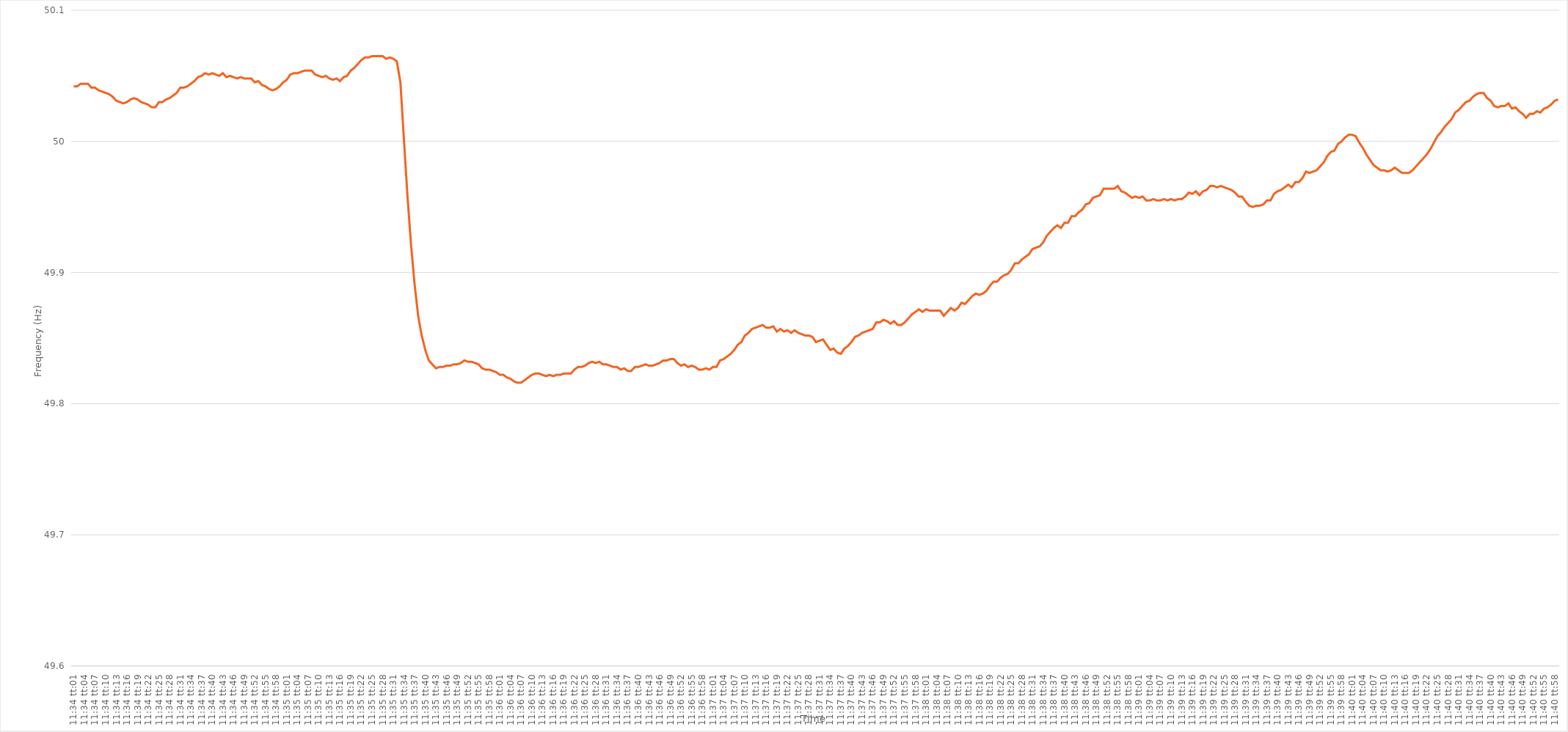
| Category | Series 0 |
|---|---|
| 0.48195601851851855 | 50.042 |
| 0.4819675925925926 | 50.042 |
| 0.4819791666666667 | 50.044 |
| 0.4819907407407407 | 50.044 |
| 0.48200231481481487 | 50.044 |
| 0.4820138888888889 | 50.041 |
| 0.48202546296296295 | 50.041 |
| 0.48203703703703704 | 50.039 |
| 0.4820486111111111 | 50.038 |
| 0.4820601851851852 | 50.037 |
| 0.4820717592592592 | 50.036 |
| 0.48208333333333336 | 50.034 |
| 0.4820949074074074 | 50.031 |
| 0.4821064814814815 | 50.03 |
| 0.48211805555555554 | 50.029 |
| 0.48212962962962963 | 50.03 |
| 0.48214120370370367 | 50.032 |
| 0.4821527777777778 | 50.033 |
| 0.48216435185185186 | 50.032 |
| 0.48217592592592595 | 50.03 |
| 0.4821875 | 50.029 |
| 0.4821990740740741 | 50.028 |
| 0.4822106481481481 | 50.026 |
| 0.4822222222222223 | 50.026 |
| 0.4822337962962963 | 50.03 |
| 0.48224537037037035 | 50.03 |
| 0.48225694444444445 | 50.032 |
| 0.4822685185185185 | 50.033 |
| 0.4822800925925926 | 50.035 |
| 0.4822916666666666 | 50.037 |
| 0.48230324074074077 | 50.041 |
| 0.4823148148148148 | 50.041 |
| 0.4823263888888889 | 50.042 |
| 0.48233796296296294 | 50.044 |
| 0.48234953703703703 | 50.046 |
| 0.4823611111111111 | 50.049 |
| 0.4823726851851852 | 50.05 |
| 0.48238425925925926 | 50.052 |
| 0.48239583333333336 | 50.051 |
| 0.4824074074074074 | 50.052 |
| 0.4824189814814815 | 50.051 |
| 0.48243055555555553 | 50.05 |
| 0.4824421296296297 | 50.052 |
| 0.4824537037037037 | 50.049 |
| 0.4824652777777778 | 50.05 |
| 0.48247685185185185 | 50.049 |
| 0.4824884259259259 | 50.048 |
| 0.4825 | 50.049 |
| 0.482511574074074 | 50.048 |
| 0.4825231481481482 | 50.048 |
| 0.4825347222222222 | 50.048 |
| 0.4825462962962963 | 50.045 |
| 0.48255787037037035 | 50.046 |
| 0.48256944444444444 | 50.043 |
| 0.4825810185185185 | 50.042 |
| 0.48259259259259263 | 50.04 |
| 0.48260416666666667 | 50.039 |
| 0.48261574074074076 | 50.04 |
| 0.4826273148148148 | 50.042 |
| 0.4826388888888889 | 50.045 |
| 0.48265046296296293 | 50.047 |
| 0.4826620370370371 | 50.051 |
| 0.4826736111111111 | 50.052 |
| 0.4826851851851852 | 50.052 |
| 0.48269675925925926 | 50.053 |
| 0.48270833333333335 | 50.054 |
| 0.4827199074074074 | 50.054 |
| 0.48273148148148143 | 50.054 |
| 0.4827430555555556 | 50.051 |
| 0.4827546296296296 | 50.05 |
| 0.4827662037037037 | 50.049 |
| 0.48277777777777775 | 50.05 |
| 0.48278935185185184 | 50.048 |
| 0.4828009259259259 | 50.047 |
| 0.48281250000000003 | 50.048 |
| 0.48282407407407407 | 50.046 |
| 0.48283564814814817 | 50.049 |
| 0.4828472222222222 | 50.05 |
| 0.4828587962962963 | 50.054 |
| 0.48287037037037034 | 50.056 |
| 0.4828819444444445 | 50.059 |
| 0.4828935185185185 | 50.062 |
| 0.4829050925925926 | 50.064 |
| 0.48291666666666666 | 50.064 |
| 0.48292824074074076 | 50.065 |
| 0.4829398148148148 | 50.065 |
| 0.48295138888888894 | 50.065 |
| 0.482962962962963 | 50.065 |
| 0.482974537037037 | 50.063 |
| 0.4829861111111111 | 50.064 |
| 0.48299768518518515 | 50.063 |
| 0.48300925925925925 | 50.061 |
| 0.4830208333333333 | 50.045 |
| 0.48303240740740744 | 50.001 |
| 0.4830439814814815 | 49.958 |
| 0.48305555555555557 | 49.921 |
| 0.4830671296296296 | 49.891 |
| 0.4830787037037037 | 49.867 |
| 0.48309027777777774 | 49.852 |
| 0.4831018518518519 | 49.841 |
| 0.48311342592592593 | 49.833 |
| 0.483125 | 49.83 |
| 0.48313657407407407 | 49.827 |
| 0.48314814814814816 | 49.828 |
| 0.4831597222222222 | 49.828 |
| 0.48317129629629635 | 49.829 |
| 0.4831828703703704 | 49.829 |
| 0.4831944444444444 | 49.83 |
| 0.4832060185185185 | 49.83 |
| 0.48321759259259256 | 49.831 |
| 0.48322916666666665 | 49.833 |
| 0.4832407407407407 | 49.832 |
| 0.48325231481481484 | 49.832 |
| 0.4832638888888889 | 49.831 |
| 0.483275462962963 | 49.83 |
| 0.483287037037037 | 49.827 |
| 0.4832986111111111 | 49.826 |
| 0.48331018518518515 | 49.826 |
| 0.4833217592592593 | 49.825 |
| 0.48333333333333334 | 49.824 |
| 0.48334490740740743 | 49.822 |
| 0.48335648148148147 | 49.822 |
| 0.48336805555555556 | 49.82 |
| 0.4833796296296296 | 49.819 |
| 0.48339120370370375 | 49.817 |
| 0.4834027777777778 | 49.816 |
| 0.4834143518518519 | 49.816 |
| 0.4834259259259259 | 49.818 |
| 0.48343749999999996 | 49.82 |
| 0.48344907407407406 | 49.822 |
| 0.4834606481481481 | 49.823 |
| 0.48347222222222225 | 49.823 |
| 0.4834837962962963 | 49.822 |
| 0.4834953703703704 | 49.821 |
| 0.4835069444444444 | 49.822 |
| 0.4835185185185185 | 49.821 |
| 0.48353009259259255 | 49.822 |
| 0.4835416666666667 | 49.822 |
| 0.48355324074074074 | 49.823 |
| 0.48356481481481484 | 49.823 |
| 0.4835763888888889 | 49.823 |
| 0.48358796296296297 | 49.826 |
| 0.483599537037037 | 49.828 |
| 0.48361111111111116 | 49.828 |
| 0.4836226851851852 | 49.829 |
| 0.4836342592592593 | 49.831 |
| 0.48364583333333333 | 49.832 |
| 0.4836574074074074 | 49.831 |
| 0.48366898148148146 | 49.832 |
| 0.4836805555555555 | 49.83 |
| 0.48369212962962965 | 49.83 |
| 0.4837037037037037 | 49.829 |
| 0.4837152777777778 | 49.828 |
| 0.4837268518518518 | 49.828 |
| 0.4837384259259259 | 49.826 |
| 0.48374999999999996 | 49.827 |
| 0.4837615740740741 | 49.825 |
| 0.48377314814814815 | 49.825 |
| 0.48378472222222224 | 49.828 |
| 0.4837962962962963 | 49.828 |
| 0.4838078703703704 | 49.829 |
| 0.4838194444444444 | 49.83 |
| 0.48383101851851856 | 49.829 |
| 0.4838425925925926 | 49.829 |
| 0.4838541666666667 | 49.83 |
| 0.48386574074074074 | 49.831 |
| 0.48387731481481483 | 49.833 |
| 0.48388888888888887 | 49.833 |
| 0.483900462962963 | 49.834 |
| 0.48391203703703706 | 49.834 |
| 0.4839236111111111 | 49.831 |
| 0.4839351851851852 | 49.829 |
| 0.48394675925925923 | 49.83 |
| 0.4839583333333333 | 49.828 |
| 0.48396990740740736 | 49.829 |
| 0.4839814814814815 | 49.828 |
| 0.48399305555555555 | 49.826 |
| 0.48400462962962965 | 49.826 |
| 0.4840162037037037 | 49.827 |
| 0.4840277777777778 | 49.826 |
| 0.4840393518518518 | 49.828 |
| 0.48405092592592597 | 49.828 |
| 0.4840625 | 49.833 |
| 0.4840740740740741 | 49.834 |
| 0.48408564814814814 | 49.836 |
| 0.48409722222222223 | 49.838 |
| 0.4841087962962963 | 49.841 |
| 0.4841203703703704 | 49.845 |
| 0.48413194444444446 | 49.847 |
| 0.4841435185185185 | 49.852 |
| 0.4841550925925926 | 49.854 |
| 0.48416666666666663 | 49.857 |
| 0.48417824074074073 | 49.858 |
| 0.48418981481481477 | 49.859 |
| 0.4842013888888889 | 49.86 |
| 0.48421296296296296 | 49.858 |
| 0.48422453703703705 | 49.858 |
| 0.4842361111111111 | 49.859 |
| 0.4842476851851852 | 49.855 |
| 0.4842592592592592 | 49.857 |
| 0.4842708333333334 | 49.855 |
| 0.4842824074074074 | 49.856 |
| 0.4842939814814815 | 49.854 |
| 0.48430555555555554 | 49.856 |
| 0.48431712962962964 | 49.854 |
| 0.4843287037037037 | 49.853 |
| 0.48434027777777783 | 49.852 |
| 0.48435185185185187 | 49.852 |
| 0.48436342592592596 | 49.851 |
| 0.484375 | 49.847 |
| 0.48438657407407404 | 49.848 |
| 0.48439814814814813 | 49.849 |
| 0.48440972222222217 | 49.845 |
| 0.4844212962962963 | 49.841 |
| 0.48443287037037036 | 49.842 |
| 0.48444444444444446 | 49.839 |
| 0.4844560185185185 | 49.838 |
| 0.4844675925925926 | 49.842 |
| 0.4844791666666666 | 49.844 |
| 0.4844907407407408 | 49.847 |
| 0.4845023148148148 | 49.851 |
| 0.4845138888888889 | 49.852 |
| 0.48452546296296295 | 49.854 |
| 0.48453703703703704 | 49.855 |
| 0.4845486111111111 | 49.856 |
| 0.48456018518518523 | 49.857 |
| 0.48457175925925927 | 49.862 |
| 0.48458333333333337 | 49.862 |
| 0.4845949074074074 | 49.864 |
| 0.4846064814814815 | 49.863 |
| 0.48461805555555554 | 49.861 |
| 0.4846296296296296 | 49.863 |
| 0.4846412037037037 | 49.86 |
| 0.48465277777777777 | 49.86 |
| 0.48466435185185186 | 49.862 |
| 0.4846759259259259 | 49.865 |
| 0.4846875 | 49.868 |
| 0.48469907407407403 | 49.87 |
| 0.4847106481481482 | 49.872 |
| 0.4847222222222222 | 49.87 |
| 0.4847337962962963 | 49.872 |
| 0.48474537037037035 | 49.871 |
| 0.48475694444444445 | 49.871 |
| 0.4847685185185185 | 49.871 |
| 0.48478009259259264 | 49.871 |
| 0.4847916666666667 | 49.867 |
| 0.48480324074074077 | 49.87 |
| 0.4848148148148148 | 49.873 |
| 0.4848263888888889 | 49.871 |
| 0.48483796296296294 | 49.873 |
| 0.484849537037037 | 49.877 |
| 0.48486111111111113 | 49.876 |
| 0.48487268518518517 | 49.879 |
| 0.48488425925925926 | 49.882 |
| 0.4848958333333333 | 49.884 |
| 0.4849074074074074 | 49.883 |
| 0.48491898148148144 | 49.884 |
| 0.4849305555555556 | 49.886 |
| 0.4849421296296296 | 49.89 |
| 0.4849537037037037 | 49.893 |
| 0.48496527777777776 | 49.893 |
| 0.48497685185185185 | 49.896 |
| 0.4849884259259259 | 49.898 |
| 0.48500000000000004 | 49.899 |
| 0.4850115740740741 | 49.902 |
| 0.4850231481481482 | 49.907 |
| 0.4850347222222222 | 49.907 |
| 0.4850462962962963 | 49.91 |
| 0.48505787037037035 | 49.912 |
| 0.4850694444444445 | 49.914 |
| 0.48508101851851854 | 49.918 |
| 0.4850925925925926 | 49.919 |
| 0.48510416666666667 | 49.92 |
| 0.4851157407407407 | 49.923 |
| 0.4851273148148148 | 49.928 |
| 0.48513888888888884 | 49.931 |
| 0.485150462962963 | 49.934 |
| 0.48516203703703703 | 49.936 |
| 0.4851736111111111 | 49.934 |
| 0.48518518518518516 | 49.938 |
| 0.48519675925925926 | 49.938 |
| 0.4852083333333333 | 49.943 |
| 0.48521990740740745 | 49.943 |
| 0.4852314814814815 | 49.946 |
| 0.4852430555555556 | 49.948 |
| 0.4852546296296296 | 49.952 |
| 0.4852662037037037 | 49.953 |
| 0.48527777777777775 | 49.957 |
| 0.4852893518518519 | 49.958 |
| 0.48530092592592594 | 49.959 |
| 0.48531250000000004 | 49.964 |
| 0.4853240740740741 | 49.964 |
| 0.4853356481481481 | 49.964 |
| 0.4853472222222222 | 49.964 |
| 0.48535879629629625 | 49.966 |
| 0.4853703703703704 | 49.962 |
| 0.48538194444444444 | 49.961 |
| 0.48539351851851853 | 49.959 |
| 0.48540509259259257 | 49.957 |
| 0.48541666666666666 | 49.958 |
| 0.4854282407407407 | 49.957 |
| 0.48543981481481485 | 49.958 |
| 0.4854513888888889 | 49.955 |
| 0.485462962962963 | 49.955 |
| 0.485474537037037 | 49.956 |
| 0.4854861111111111 | 49.955 |
| 0.48549768518518516 | 49.955 |
| 0.4855092592592593 | 49.956 |
| 0.48552083333333335 | 49.955 |
| 0.48553240740740744 | 49.956 |
| 0.4855439814814815 | 49.955 |
| 0.4855555555555556 | 49.956 |
| 0.4855671296296296 | 49.956 |
| 0.48557870370370365 | 49.958 |
| 0.4855902777777778 | 49.961 |
| 0.48560185185185184 | 49.96 |
| 0.48561342592592593 | 49.962 |
| 0.485625 | 49.959 |
| 0.48563657407407407 | 49.962 |
| 0.4856481481481481 | 49.963 |
| 0.48565972222222226 | 49.966 |
| 0.4856712962962963 | 49.966 |
| 0.4856828703703704 | 49.965 |
| 0.48569444444444443 | 49.966 |
| 0.4857060185185185 | 49.965 |
| 0.48571759259259256 | 49.964 |
| 0.4857291666666667 | 49.963 |
| 0.48574074074074075 | 49.961 |
| 0.48575231481481485 | 49.958 |
| 0.4857638888888889 | 49.958 |
| 0.485775462962963 | 49.954 |
| 0.485787037037037 | 49.951 |
| 0.48579861111111106 | 49.95 |
| 0.4858101851851852 | 49.951 |
| 0.48582175925925924 | 49.951 |
| 0.48583333333333334 | 49.952 |
| 0.4858449074074074 | 49.955 |
| 0.4858564814814815 | 49.955 |
| 0.4858680555555555 | 49.96 |
| 0.48587962962962966 | 49.962 |
| 0.4858912037037037 | 49.963 |
| 0.4859027777777778 | 49.965 |
| 0.48591435185185183 | 49.967 |
| 0.48592592592592593 | 49.965 |
| 0.48593749999999997 | 49.969 |
| 0.4859490740740741 | 49.969 |
| 0.48596064814814816 | 49.972 |
| 0.48597222222222225 | 49.977 |
| 0.4859837962962963 | 49.976 |
| 0.4859953703703704 | 49.977 |
| 0.4860069444444444 | 49.978 |
| 0.48601851851851857 | 49.981 |
| 0.4860300925925926 | 49.984 |
| 0.48604166666666665 | 49.989 |
| 0.48605324074074074 | 49.992 |
| 0.4860648148148148 | 49.993 |
| 0.4860763888888889 | 49.998 |
| 0.4860879629629629 | 50 |
| 0.48609953703703707 | 50.003 |
| 0.4861111111111111 | 50.005 |
| 0.4861226851851852 | 50.005 |
| 0.48613425925925924 | 50.004 |
| 0.48614583333333333 | 49.999 |
| 0.48615740740740737 | 49.995 |
| 0.4861689814814815 | 49.99 |
| 0.48618055555555556 | 49.986 |
| 0.48619212962962965 | 49.982 |
| 0.4862037037037037 | 49.98 |
| 0.4862152777777778 | 49.978 |
| 0.4862268518518518 | 49.978 |
| 0.486238425925926 | 49.977 |
| 0.48625 | 49.978 |
| 0.4862615740740741 | 49.98 |
| 0.48627314814814815 | 49.978 |
| 0.4862847222222222 | 49.976 |
| 0.4862962962962963 | 49.976 |
| 0.4863078703703703 | 49.976 |
| 0.48631944444444447 | 49.978 |
| 0.4863310185185185 | 49.981 |
| 0.4863425925925926 | 49.984 |
| 0.48635416666666664 | 49.987 |
| 0.48636574074074074 | 49.99 |
| 0.4863773148148148 | 49.994 |
| 0.4863888888888889 | 49.999 |
| 0.48640046296296297 | 50.004 |
| 0.48641203703703706 | 50.007 |
| 0.4864236111111111 | 50.011 |
| 0.4864351851851852 | 50.014 |
| 0.48644675925925923 | 50.017 |
| 0.4864583333333334 | 50.022 |
| 0.4864699074074074 | 50.024 |
| 0.4864814814814815 | 50.027 |
| 0.48649305555555555 | 50.03 |
| 0.48650462962962965 | 50.031 |
| 0.4865162037037037 | 50.034 |
| 0.4865277777777777 | 50.036 |
| 0.4865393518518519 | 50.037 |
| 0.4865509259259259 | 50.037 |
| 0.4865625 | 50.033 |
| 0.48657407407407405 | 50.031 |
| 0.48658564814814814 | 50.027 |
| 0.4865972222222222 | 50.026 |
| 0.48660879629629633 | 50.027 |
| 0.48662037037037037 | 50.027 |
| 0.48663194444444446 | 50.029 |
| 0.4866435185185185 | 50.025 |
| 0.4866550925925926 | 50.026 |
| 0.48666666666666664 | 50.023 |
| 0.4866782407407408 | 50.021 |
| 0.4866898148148148 | 50.018 |
| 0.4867013888888889 | 50.021 |
| 0.48671296296296296 | 50.021 |
| 0.48672453703703705 | 50.023 |
| 0.4867361111111111 | 50.022 |
| 0.48674768518518513 | 50.025 |
| 0.4867592592592593 | 50.026 |
| 0.4867708333333333 | 50.028 |
| 0.4867824074074074 | 50.031 |
| 0.48679398148148145 | 50.032 |